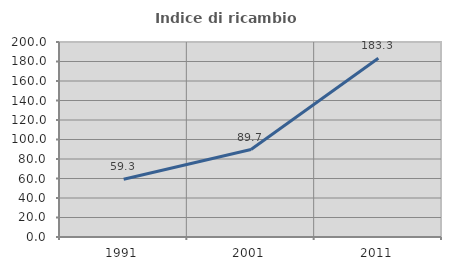
| Category | Indice di ricambio occupazionale  |
|---|---|
| 1991.0 | 59.297 |
| 2001.0 | 89.724 |
| 2011.0 | 183.333 |